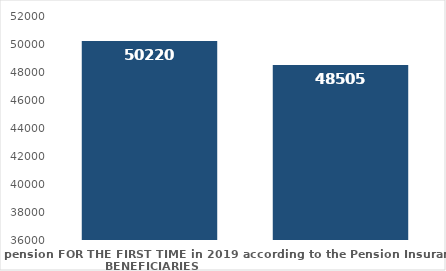
| Category | broj korisnika |
|---|---|
| Pension beneficiaries entitled to pension FOR THE FIRST TIME in 2019 according to the Pension Insurance Act  - NEW BENEFICIARIES | 50220 |
| Pension beneficiaries whose pension entitlement ceased in 2019  -  death caused,   
and who were retired according to the Pension Insurance Act   | 48505 |